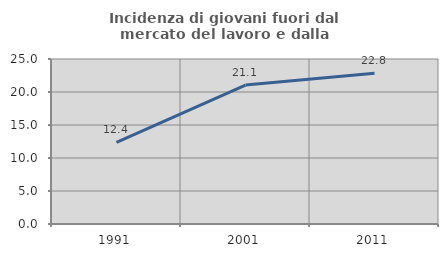
| Category | Incidenza di giovani fuori dal mercato del lavoro e dalla formazione  |
|---|---|
| 1991.0 | 12.358 |
| 2001.0 | 21.053 |
| 2011.0 | 22.831 |